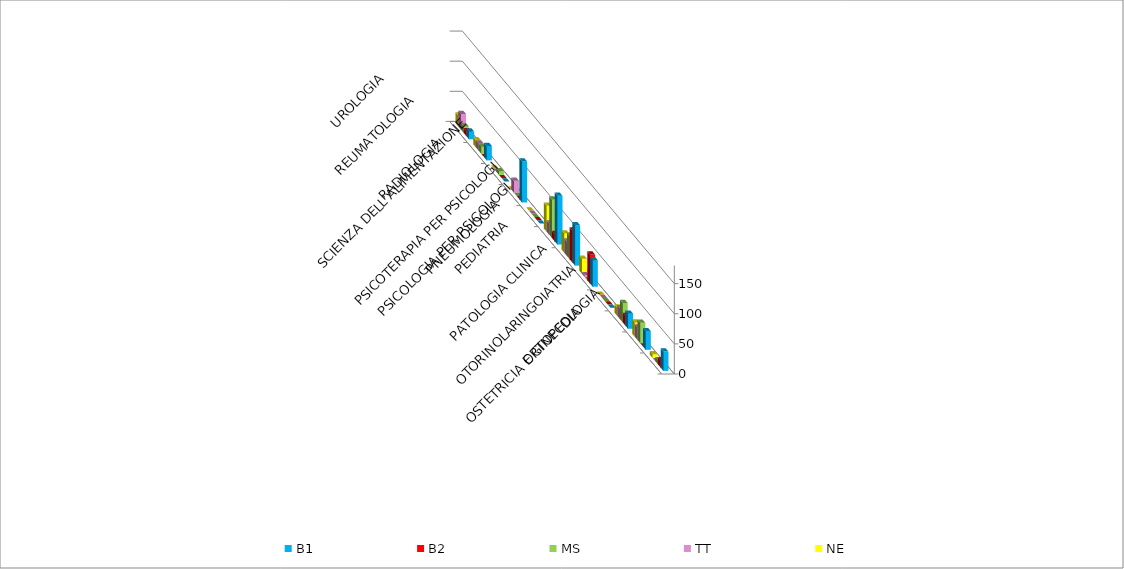
| Category | B1 | B2 | MS | TT | NE |
|---|---|---|---|---|---|
| ORTOPEDIA | 32 | 12 | 7 | 0 | 6 |
| OSTETRICIA E GINECOLOGIA | 31 | 0 | 34 | 21 | 24 |
| OTORINOLARINGOIATRIA | 25 | 16 | 32 | 18 | 14 |
| PATOLOGIA CLINICA | 0 | 0 | 0 | 0 | 0 |
| PEDIATRIA | 44 | 48 | 0 | 3 | 25 |
| PNEUMOLOGIA | 67 | 53 | 39 | 24 | 32 |
| PSICOLOGIA PER PSICOLOGI | 81 | 12 | 64 | 19 | 43 |
| PSICOTERAPIA PER PSICOLOGI | 0 | 0 | 0 | 0 | 0 |
| RADIOLOGIA | 68 | 0 | 0 | 20 | 0 |
| SCIENZA DELL'ALIMENTAZIONE | 0 | 0 | 6 | 0 | 0 |
| REUMATOLOGIA | 24 | 0 | 12 | 12 | 12 |
| UROLOGIA | 13 | 8 | 11 | 26 | 18 |